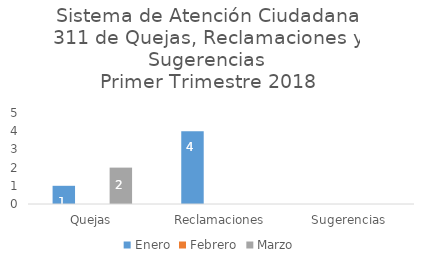
| Category | Enero | Febrero | Marzo |
|---|---|---|---|
| Quejas | 1 | 0 | 2 |
| Reclamaciones | 4 | 0 | 0 |
| Sugerencias | 0 | 0 | 0 |